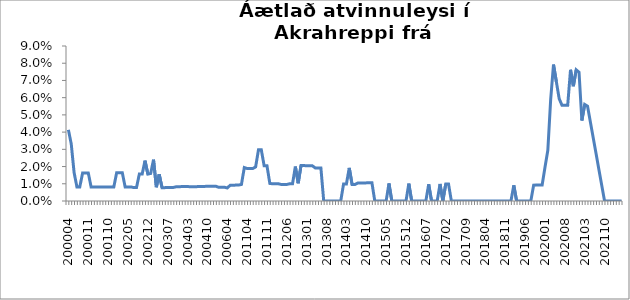
| Category | Series 0 |
|---|---|
| 200004 | 0.041 |
| 200005 | 0.033 |
| 200006 | 0.017 |
| 200007 | 0.008 |
| 200008 | 0.008 |
| 200009 | 0.016 |
| 200010 | 0.016 |
| 200011 | 0.016 |
| 200012 | 0.008 |
| 200101 | 0.008 |
| 200102 | 0.008 |
| 200103 | 0.008 |
| 200104 | 0.008 |
| 200109 | 0.008 |
| 200110 | 0.008 |
| 200111 | 0.008 |
| 200112 | 0.008 |
| 200201 | 0.016 |
| 200202 | 0.016 |
| 200203 | 0.016 |
| 200204 | 0.008 |
| 200205 | 0.008 |
| 200206 | 0.008 |
| 200207 | 0.008 |
| 200208 | 0.008 |
| 200209 | 0.016 |
| 200210 | 0.016 |
| 200211 | 0.023 |
| 200212 | 0.016 |
| 200301 | 0.016 |
| 200302 | 0.024 |
| 200303 | 0.008 |
| 200304 | 0.016 |
| 200305 | 0.008 |
| 200306 | 0.008 |
| 200307 | 0.008 |
| 200308 | 0.008 |
| 200309 | 0.008 |
| 200310 | 0.008 |
| 200312 | 0.008 |
| 200401 | 0.008 |
| 200402 | 0.008 |
| 200403 | 0.008 |
| 200404 | 0.008 |
| 200405 | 0.008 |
| 200406 | 0.008 |
| 200407 | 0.008 |
| 200408 | 0.008 |
| 200409 | 0.008 |
| 200410 | 0.009 |
| 200411 | 0.009 |
| 200412 | 0.009 |
| 200501 | 0.009 |
| 200512 | 0.008 |
| 200602 | 0.008 |
| 200603 | 0.008 |
| 200604 | 0.008 |
| 201002 | 0.009 |
| 201003 | 0.009 |
| 201004 | 0.009 |
| 201005 | 0.009 |
| 201012 | 0.01 |
| 201103 | 0.019 |
| 201104 | 0.019 |
| 201105 | 0.019 |
| 201106 | 0.019 |
| 201107 | 0.02 |
| 201108 | 0.03 |
| 201109 | 0.03 |
| 201110 | 0.02 |
| 201111 | 0.02 |
| 201112 | 0.01 |
| 201201 | 0.01 |
| 201202 | 0.01 |
| 201203 | 0.01 |
| 201204 | 0.01 |
| 201205 | 0.01 |
| 201206 | 0.01 |
| 201207 | 0.01 |
| 201208 | 0.01 |
| 201209 | 0.02 |
| 201210 | 0.01 |
| 201211 | 0.021 |
| 201212 | 0.021 |
| 201301 | 0.02 |
| 201302 | 0.02 |
| 201303 | 0.02 |
| 201304 | 0.019 |
| 201305 | 0.019 |
| 201306 | 0.019 |
| 201307 | 0 |
| 201308 | 0 |
| 201309 | 0 |
| 201310 | 0 |
| 201311 | 0 |
| 201312 | 0 |
| 201401 | 0 |
| 201402 | 0.01 |
| 201403 | 0.01 |
| 201404 | 0.019 |
| 201405 | 0.01 |
| 201406 | 0.01 |
| 201407 | 0.01 |
| 201408 | 0.01 |
| 201409 | 0.01 |
| 201410 | 0.011 |
| 201411 | 0.011 |
| 201412 | 0.011 |
| 201501 | 0 |
| 201502 | 0 |
| 201503 | 0 |
| 201504 | 0 |
| 201505 | 0 |
| 201506 | 0.01 |
| 201507 | 0 |
| 201508 | 0 |
| 201509 | 0 |
| 201510 | 0 |
| 201511 | 0 |
| 201512 | 0 |
| 201601 | 0.01 |
| 201602 | 0 |
| 201603 | 0 |
| 201604 | 0 |
| 201605 | 0 |
| 201606 | 0 |
| 201607 | 0 |
| 201608 | 0.01 |
| 201609 | 0 |
| 201610 | 0 |
| 201611 | 0 |
| 201612 | 0.01 |
| 201701 | 0 |
| 201702 | 0.01 |
| 201703 | 0.01 |
| 201704 | 0 |
| 201705 | 0 |
| 201706 | 0 |
| 201707 | 0 |
| 201708 | 0 |
| 201709 | 0 |
| 201710 | 0 |
| 201711 | 0 |
| 201712 | 0 |
| 201801 | 0 |
| 201802 | 0 |
| 201803 | 0 |
| 201804 | 0 |
| 201805 | 0 |
| 201806 | 0 |
| 201807 | 0 |
| 201808 | 0 |
| 201809 | 0 |
| 201810 | 0 |
| 201811 | 0 |
| 201812 | 0 |
| 201901 | 0 |
| 201902 | 0.009 |
| 201903 | 0 |
| 201904 | 0 |
| 201905 | 0 |
| 201906 | 0 |
| 201907 | 0 |
| 201908 | 0 |
| 201909 | 0.009 |
| 201910 | 0.009 |
| 201911 | 0.009 |
| 201912 | 0.009 |
| 202001 | 0.02 |
| 202002 | 0.029 |
| 202003 | 0.059 |
| 202004 | 0.079 |
| 202005 | 0.069 |
| 202006 | 0.059 |
| 202007 | 0.056 |
| 202008 | 0.056 |
| 202009 | 0.056 |
| 202010 | 0.076 |
| 202011 | 0.067 |
| 202012 | 0.076 |
| 202101 | 0.075 |
| 202102 | 0.047 |
| 202103 | 0.056 |
| 202104 | 0.055 |
| 202105 | 0.046 |
| 202106 | 0.037 |
| 202107 | 0.028 |
| 202108 | 0.018 |
| 202109 | 0.009 |
| 202110 | 0 |
| 202111 | 0 |
| 202112 | 0 |
| 202201 | 0 |
| 202202 | 0 |
| 202203 | 0 |
| 202204 | 0 |